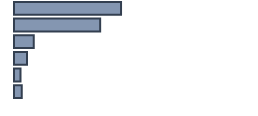
| Category | Percentatge |
|---|---|
| 0 | 44.6 |
| 1 | 35.9 |
| 2 | 8.2 |
| 3 | 5.4 |
| 4 | 2.7 |
| 5 | 3.261 |